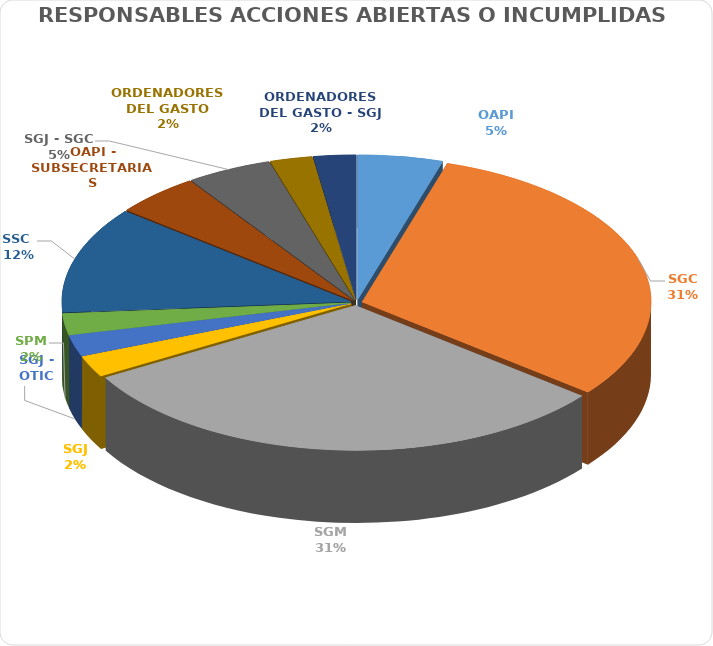
| Category | Series 0 |
|---|---|
| OAPI | 2 |
| SGC | 13 |
| SGM | 13 |
| SGJ | 1 |
| SGJ - OTIC | 1 |
| SPM | 1 |
| SSC  | 5 |
| OAPI - SUBSECRETARIAS | 2 |
| SGJ - SGC | 2 |
| ORDENADORES DEL GASTO | 1 |
| ORDENADORES DEL GASTO - SGJ | 1 |